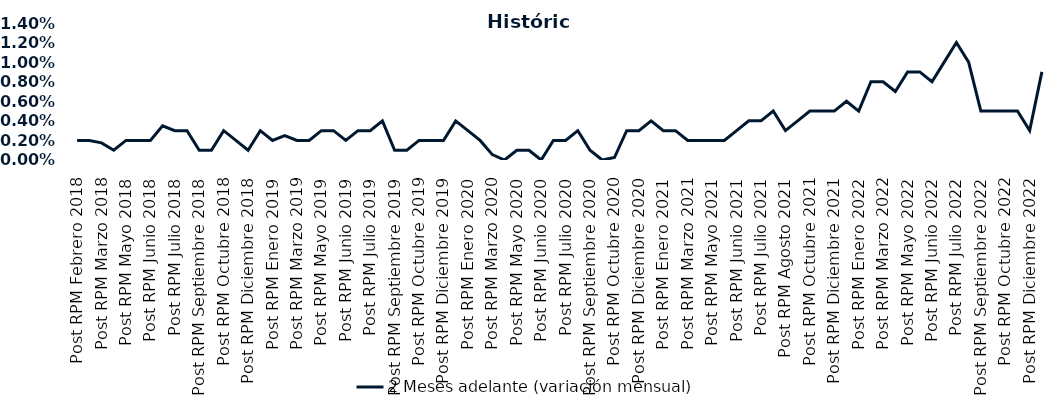
| Category | 2 Meses adelante (variación mensual) |
|---|---|
| Post RPM Febrero 2018 | 0.002 |
| Pre RPM Marzo 2018 | 0.002 |
| Post RPM Marzo 2018 | 0.002 |
| Pre RPM Mayo 2018 | 0.001 |
| Post RPM Mayo 2018 | 0.002 |
| Pre RPM Junio 2018 | 0.002 |
| Post RPM Junio 2018 | 0.002 |
| Pre RPM Julio 2018 | 0.004 |
| Post RPM Julio 2018 | 0.003 |
| Pre RPM Septiembre 2018 | 0.003 |
| Post RPM Septiembre 2018 | 0.001 |
| Pre RPM Octubre 2018 | 0.001 |
| Post RPM Octubre 2018 | 0.003 |
| Pre RPM Diciembre 2018 | 0.002 |
| Post RPM Diciembre 2018 | 0.001 |
| Pre RPM Enero 2019 | 0.003 |
| Post RPM Enero 2019 | 0.002 |
| Pre RPM Marzo 2019 | 0.002 |
| Post RPM Marzo 2019 | 0.002 |
| Pre RPM Mayo 2019 | 0.002 |
| Post RPM Mayo 2019 | 0.003 |
| Pre RPM Junio 2019 | 0.003 |
| Post RPM Junio 2019 | 0.002 |
| Pre RPM Julio 2019 | 0.003 |
| Post RPM Julio 2019 | 0.003 |
| Pre RPM Septiembre 2019 | 0.004 |
| Post RPM Septiembre 2019 | 0.001 |
| Pre RPM Octubre 2019 | 0.001 |
| Post RPM Octubre 2019 | 0.002 |
| Pre RPM Diciembre 2019 | 0.002 |
| Post RPM Diciembre 2019 | 0.002 |
| Pre RPM Enero 2020 | 0.004 |
| Post RPM Enero 2020 | 0.003 |
| Pre RPM Marzo 2020 | 0.002 |
| Post RPM Marzo 2020 | 0.001 |
| Pre RPM Mayo 2020 | 0 |
| Post RPM Mayo 2020 | 0.001 |
| Pre RPM Junio 2020 | 0.001 |
| Post RPM Junio 2020 | 0 |
| Pre RPM Julio 2020 | 0.002 |
| Post RPM Julio 2020 | 0.002 |
| Pre RPM Septiembre 2020 | 0.003 |
| Post RPM Septiembre 2020 | 0.001 |
| Pre RPM Octubre 2020 | 0 |
| Post RPM Octubre 2020 | 0 |
| Pre RPM Diciembre 2020 | 0.003 |
| Post RPM Diciembre 2020 | 0.003 |
| Pre RPM Enero 2021 | 0.004 |
| Post RPM Enero 2021 | 0.003 |
| Pre RPM Marzo 2021 | 0.003 |
| Post RPM Marzo 2021 | 0.002 |
| Pre RPM Mayo 2021 | 0.002 |
| Post RPM Mayo 2021 | 0.002 |
| Pre RPM Junio 2021 | 0.002 |
| Post RPM Junio 2021 | 0.003 |
| Pre RPM Julio 2021 | 0.004 |
| Post RPM Julio 2021 | 0.004 |
| Pre RPM Agosto 2021 | 0.005 |
| Post RPM Agosto 2021 | 0.003 |
| Pre RPM Octubre 2021 | 0.004 |
| Post RPM Octubre 2021 | 0.005 |
| Pre RPM Diciembre 2021 | 0.005 |
| Post RPM Diciembre 2021 | 0.005 |
| Pre RPM Enero 2022 | 0.006 |
| Post RPM Enero 2022 | 0.005 |
| Pre RPM Marzo 2022 | 0.008 |
| Post RPM Marzo 2022 | 0.008 |
| Pre RPM Mayo 2022 | 0.007 |
| Post RPM Mayo 2022 | 0.009 |
| Pre RPM Junio 2022 | 0.009 |
| Post RPM Junio 2022 | 0.008 |
| Pre RPM Julio 2022 | 0.01 |
| Post RPM Julio 2022 | 0.012 |
| Pre RPM Septiembre 2022 | 0.01 |
| Post RPM Septiembre 2022 | 0.005 |
| Pre RPM Octubre 2022 | 0.005 |
| Post RPM Octubre 2022 | 0.005 |
| Pre RPM Diciembre 2022 | 0.005 |
| Post RPM Diciembre 2022 | 0.003 |
| Pre RPM Enero 2023 | 0.009 |